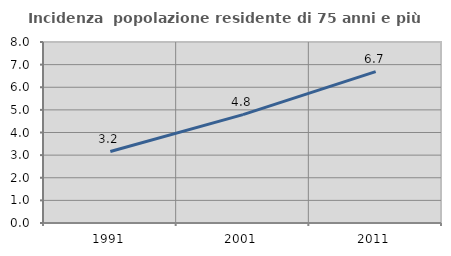
| Category | Incidenza  popolazione residente di 75 anni e più |
|---|---|
| 1991.0 | 3.158 |
| 2001.0 | 4.789 |
| 2011.0 | 6.692 |